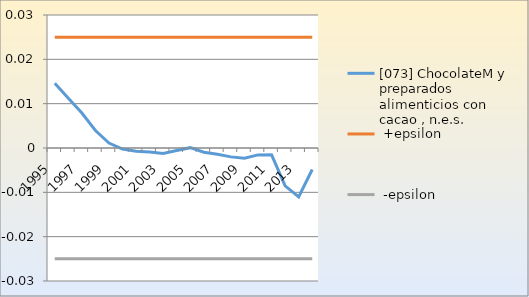
| Category | [073] ChocolateM y preparados alimenticios con cacao , n.e.s. |  +epsilon |  -epsilon |
|---|---|---|---|
| 1995.0 | 0.015 | 0.025 | -0.025 |
| 1996.0 | 0.011 | 0.025 | -0.025 |
| 1997.0 | 0.008 | 0.025 | -0.025 |
| 1998.0 | 0.004 | 0.025 | -0.025 |
| 1999.0 | 0.001 | 0.025 | -0.025 |
| 2000.0 | 0 | 0.025 | -0.025 |
| 2001.0 | -0.001 | 0.025 | -0.025 |
| 2002.0 | -0.001 | 0.025 | -0.025 |
| 2003.0 | -0.001 | 0.025 | -0.025 |
| 2004.0 | -0.001 | 0.025 | -0.025 |
| 2005.0 | 0 | 0.025 | -0.025 |
| 2006.0 | -0.001 | 0.025 | -0.025 |
| 2007.0 | -0.001 | 0.025 | -0.025 |
| 2008.0 | -0.002 | 0.025 | -0.025 |
| 2009.0 | -0.002 | 0.025 | -0.025 |
| 2010.0 | -0.002 | 0.025 | -0.025 |
| 2011.0 | -0.002 | 0.025 | -0.025 |
| 2012.0 | -0.009 | 0.025 | -0.025 |
| 2013.0 | -0.011 | 0.025 | -0.025 |
| 2014.0 | -0.005 | 0.025 | -0.025 |